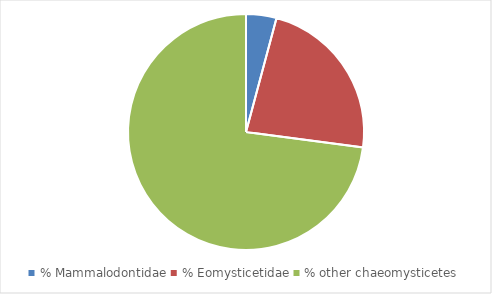
| Category | Series 0 |
|---|---|
| % Mammalodontidae | 0.042 |
| % Eomysticetidae | 0.229 |
| % other chaeomysticetes | 0.729 |